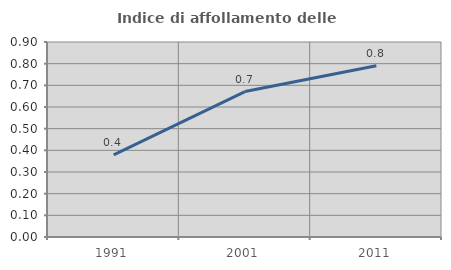
| Category | Indice di affollamento delle abitazioni  |
|---|---|
| 1991.0 | 0.379 |
| 2001.0 | 0.671 |
| 2011.0 | 0.791 |